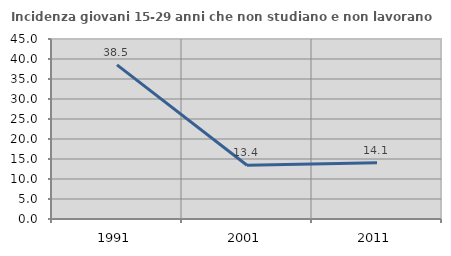
| Category | Incidenza giovani 15-29 anni che non studiano e non lavorano  |
|---|---|
| 1991.0 | 38.525 |
| 2001.0 | 13.436 |
| 2011.0 | 14.054 |